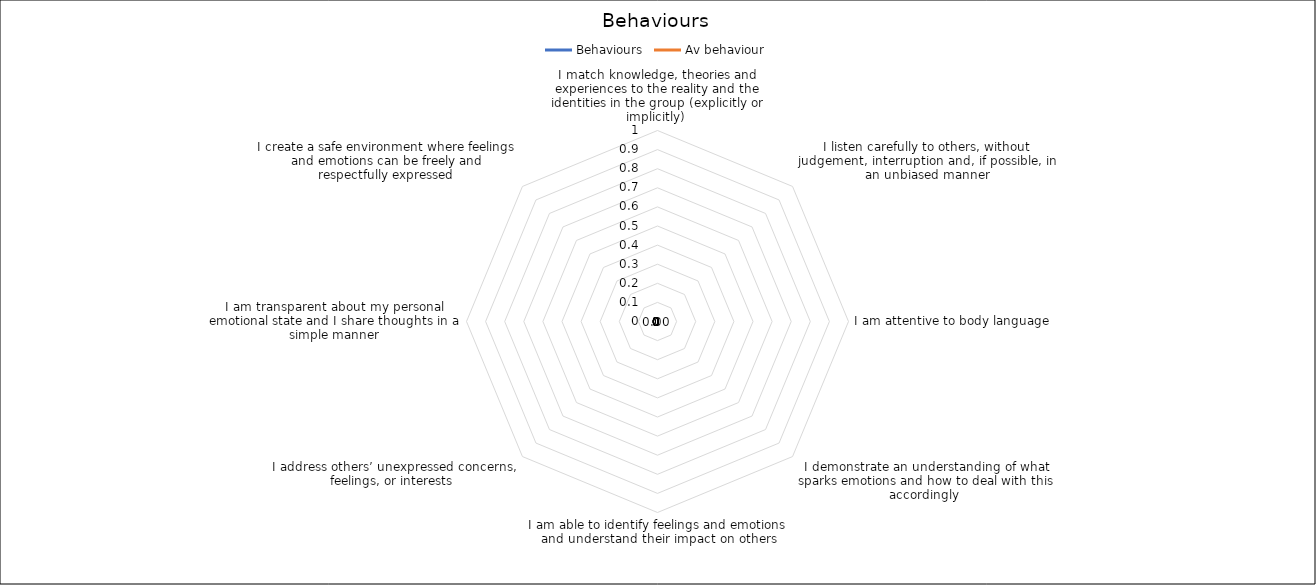
| Category | Behaviours | Av behaviour |
|---|---|---|
| I match knowledge, theories and experiences to the reality and the identities in the group (explicitly or implicitly)  | 0 | 0 |
| I listen carefully to others, without judgement, interruption and, if possible, in an unbiased manner | 0 | 0 |
| I am attentive to body language | 0 | 0 |
| I demonstrate an understanding of what sparks emotions and how to deal with this accordingly  | 0 | 0 |
| I am able to identify feelings and emotions and understand their impact on others | 0 | 0 |
| I address others’ unexpressed concerns, feelings, or interests  | 0 | 0 |
| I am transparent about my personal emotional state and I share thoughts in a simple manner | 0 | 0 |
| I create a safe environment where feelings and emotions can be freely and respectfully expressed | 0 | 0 |